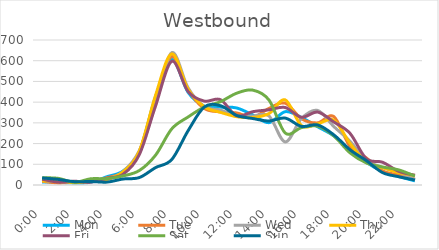
| Category | Mon | Tue | Wed | Thu | Fri | Sat | Sun |
|---|---|---|---|---|---|---|---|
| 0.0 | 15 | 18 | 21 | 19 | 28 | 35 | 34 |
| 0.041667 | 13 | 10 | 17 | 21 | 14 | 32 | 27 |
| 0.083333 | 10 | 14 | 12 | 11 | 18 | 13 | 16 |
| 0.125 | 13 | 16 | 20 | 19 | 14 | 30 | 17 |
| 0.166667 | 40 | 35 | 28 | 27 | 32 | 31 | 14 |
| 0.208333 | 68 | 62 | 65 | 64 | 52 | 44 | 29 |
| 0.25 | 159 | 163 | 166 | 164 | 147 | 70 | 36 |
| 0.291667 | 427 | 416 | 389 | 433 | 382 | 144 | 84 |
| 0.333333 | 606 | 620 | 639 | 633 | 597 | 271 | 123 |
| 0.375 | 448 | 460 | 470 | 464 | 452 | 328 | 261 |
| 0.416667 | 381 | 370 | 379 | 378 | 405 | 376 | 376 |
| 0.458333 | 376 | 353 | 362 | 351 | 412 | 402 | 383 |
| 0.5 | 372 | 348 | 331 | 330 | 334 | 443 | 336 |
| 0.541667 | 338 | 327 | 333 | 326 | 354 | 458 | 321 |
| 0.5833333333333334 | 301 | 370 | 333 | 345 | 363 | 410 | 309 |
| 0.625 | 354 | 395 | 208 | 411 | 374 | 251 | 323 |
| 0.666667 | 326 | 320 | 321 | 287 | 327 | 277 | 283 |
| 0.708333 | 281 | 300 | 360 | 295 | 352 | 284 | 290 |
| 0.75 | 237 | 330 | 282 | 313 | 304 | 237 | 242 |
| 0.791667 | 168 | 185 | 211 | 201 | 249 | 155 | 170 |
| 0.833333 | 109 | 131 | 120 | 111 | 127 | 107 | 118 |
| 0.875 | 66 | 68 | 85 | 84 | 110 | 87 | 60 |
| 0.916667 | 41 | 49 | 62 | 60 | 66 | 73 | 40 |
| 0.958333 | 20 | 28 | 25 | 46 | 47 | 43 | 24 |